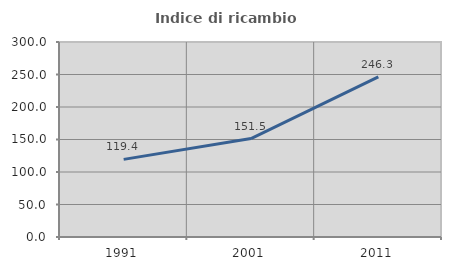
| Category | Indice di ricambio occupazionale  |
|---|---|
| 1991.0 | 119.431 |
| 2001.0 | 151.481 |
| 2011.0 | 246.283 |